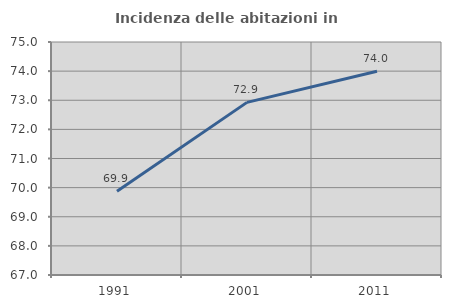
| Category | Incidenza delle abitazioni in proprietà  |
|---|---|
| 1991.0 | 69.877 |
| 2001.0 | 72.927 |
| 2011.0 | 73.996 |